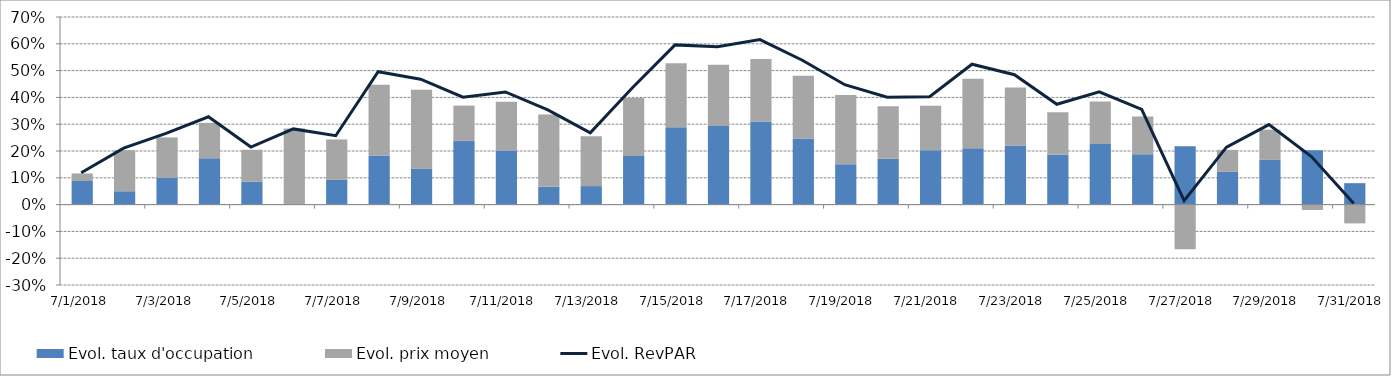
| Category | Evol. taux d'occupation | Evol. prix moyen |
|---|---|---|
| 7/1/18 | 0.088 | 0.028 |
| 7/2/18 | 0.05 | 0.153 |
| 7/3/18 | 0.101 | 0.15 |
| 7/4/18 | 0.172 | 0.132 |
| 7/5/18 | 0.085 | 0.119 |
| 7/6/18 | -0.001 | 0.284 |
| 7/7/18 | 0.092 | 0.151 |
| 7/8/18 | 0.184 | 0.264 |
| 7/9/18 | 0.134 | 0.294 |
| 7/10/18 | 0.238 | 0.132 |
| 7/11/18 | 0.201 | 0.182 |
| 7/12/18 | 0.066 | 0.27 |
| 7/13/18 | 0.069 | 0.186 |
| 7/14/18 | 0.182 | 0.216 |
| 7/15/18 | 0.289 | 0.238 |
| 7/16/18 | 0.293 | 0.229 |
| 7/17/18 | 0.31 | 0.234 |
| 7/18/18 | 0.247 | 0.234 |
| 7/19/18 | 0.151 | 0.258 |
| 7/20/18 | 0.171 | 0.197 |
| 7/21/18 | 0.202 | 0.167 |
| 7/22/18 | 0.211 | 0.259 |
| 7/23/18 | 0.22 | 0.217 |
| 7/24/18 | 0.186 | 0.159 |
| 7/25/18 | 0.226 | 0.158 |
| 7/26/18 | 0.188 | 0.141 |
| 7/27/18 | 0.218 | -0.167 |
| 7/28/18 | 0.122 | 0.082 |
| 7/29/18 | 0.167 | 0.113 |
| 7/30/18 | 0.203 | -0.02 |
| 7/31/18 | 0.08 | -0.07 |